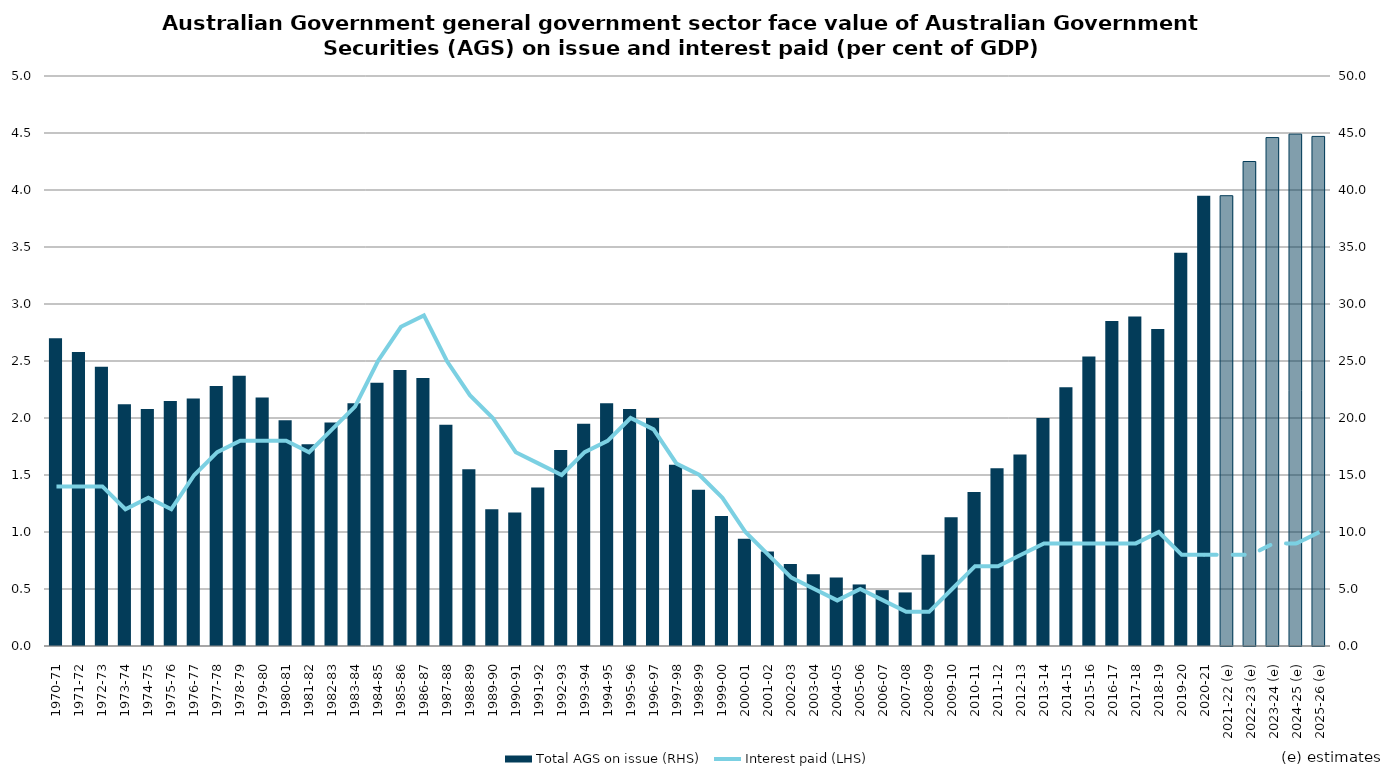
| Category | Total AGS on issue (RHS) |
|---|---|
| 1970-71 | 27 |
| 1971-72 | 25.8 |
| 1972-73 | 24.5 |
| 1973-74 | 21.2 |
| 1974-75 | 20.8 |
| 1975-76 | 21.5 |
| 1976-77 | 21.7 |
| 1977-78 | 22.8 |
| 1978-79 | 23.7 |
| 1979-80 | 21.8 |
| 1980-81 | 19.8 |
| 1981-82 | 17.7 |
| 1982-83 | 19.6 |
| 1983-84 | 21.3 |
| 1984-85 | 23.1 |
| 1985-86 | 24.2 |
| 1986-87 | 23.5 |
| 1987-88 | 19.4 |
| 1988-89 | 15.5 |
| 1989-90 | 12 |
| 1990-91 | 11.7 |
| 1991-92 | 13.9 |
| 1992-93 | 17.2 |
| 1993-94 | 19.5 |
| 1994-95 | 21.3 |
| 1995-96 | 20.8 |
| 1996-97 | 20 |
| 1997-98 | 15.9 |
| 1998-99 | 13.7 |
| 1999-00 | 11.4 |
| 2000-01 | 9.4 |
| 2001-02 | 8.3 |
| 2002-03 | 7.2 |
| 2003-04 | 6.3 |
| 2004-05 | 6 |
| 2005-06 | 5.4 |
| 2006-07 | 4.9 |
| 2007-08 | 4.7 |
| 2008-09 | 8 |
| 2009-10 | 11.3 |
| 2010-11 | 13.5 |
| 2011-12 | 15.6 |
| 2012-13 | 16.8 |
| 2013-14 | 20 |
| 2014-15 | 22.7 |
| 2015-16 | 25.4 |
| 2016-17 | 28.5 |
| 2017-18 | 28.9 |
| 2018-19 | 27.8 |
| 2019-20 | 34.5 |
| 2020-21 (e) | 39.5 |
| 2021-22 (e) | 39.5 |
| 2022-23 (e) | 42.5 |
| 2023-24 (e) | 44.6 |